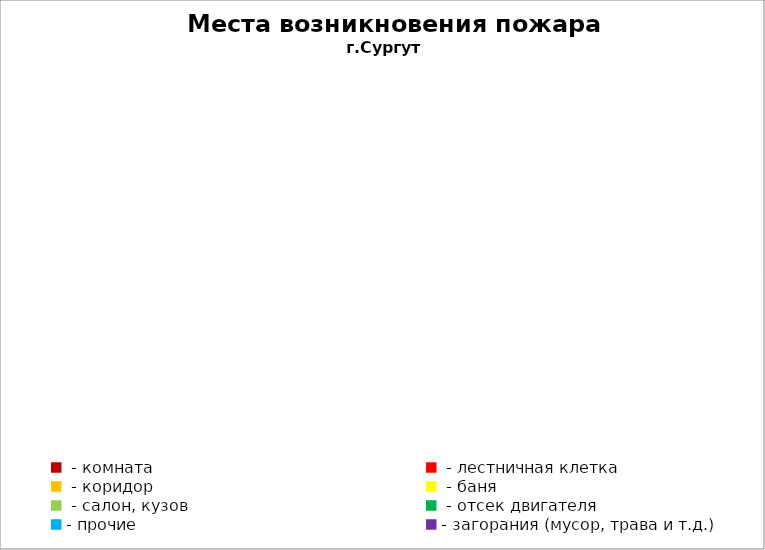
| Category | Места возникновения пожара |
|---|---|
|  - комната | 75 |
|  - лестничная клетка | 37 |
|  - коридор | 5 |
|  - баня | 58 |
|  - салон, кузов | 30 |
|  - отсек двигателя | 29 |
| - прочие | 125 |
| - загорания (мусор, трава и т.д.)  | 187 |